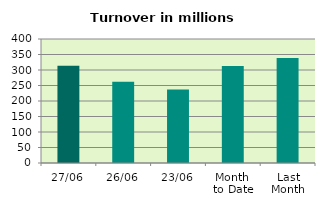
| Category | Series 0 |
|---|---|
| 27/06 | 313.658 |
| 26/06 | 262.001 |
| 23/06 | 237.398 |
| Month 
to Date | 312.841 |
| Last
Month | 338.969 |